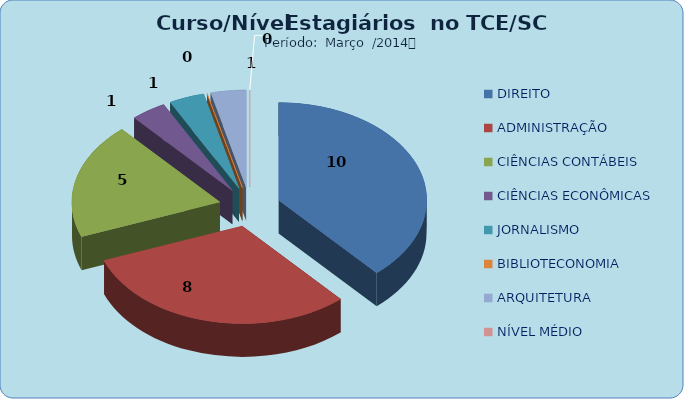
| Category | Series 0 |
|---|---|
| DIREITO | 10 |
| ADMINISTRAÇÃO | 8 |
| CIÊNCIAS CONTÁBEIS | 5 |
| CIÊNCIAS ECONÔMICAS | 1 |
| JORNALISMO | 1 |
| BIBLIOTECONOMIA | 0 |
| ARQUITETURA | 1 |
| NÍVEL MÉDIO | 0 |